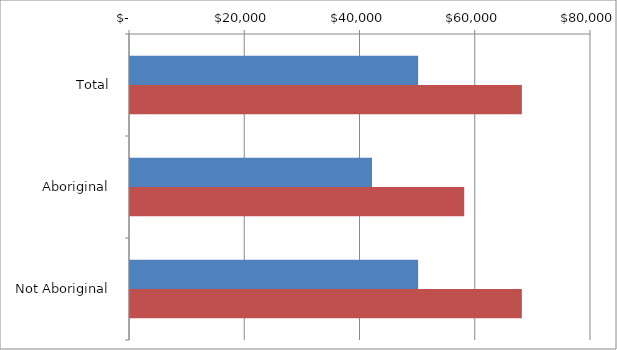
| Category | Series 0 | Series 1 |
|---|---|---|
| Total | 50000 | 68000 |
|  Aboriginal  | 42000 | 58000 |
|  Not Aboriginal  | 50000 | 68000 |